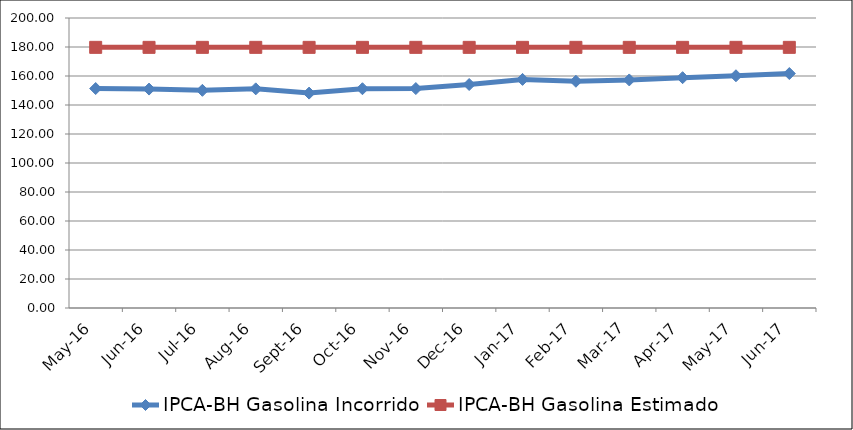
| Category | IPCA-BH Gasolina Incorrido | IPCA-BH Gasolina Estimado |
|---|---|---|
| 2016-05-01 | 151.353 | 179.756 |
| 2016-06-01 | 150.99 | 179.756 |
| 2016-07-01 | 150.114 | 179.756 |
| 2016-08-01 | 151.135 | 179.756 |
| 2016-09-01 | 148.203 | 179.756 |
| 2016-10-01 | 151.226 | 179.756 |
| 2016-11-01 | 151.332 | 179.756 |
| 2016-12-01 | 154.132 | 179.756 |
| 2017-01-01 | 157.646 | 179.756 |
| 2017-02-01 | 156.369 | 179.756 |
| 2017-03-01 | 157.279 | 179.756 |
| 2017-04-01 | 158.855 | 179.756 |
| 2017-05-01 | 160.171 | 179.756 |
| 2017-06-01 | 161.702 | 179.756 |